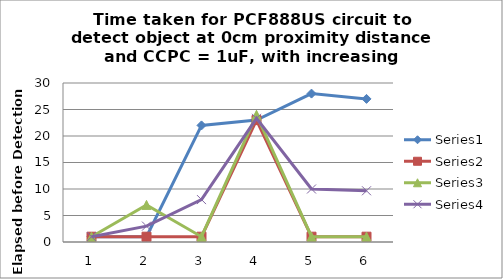
| Category | Series 0 | Series 1 | Series 2 | Series 3 |
|---|---|---|---|---|
| 0 | 1 | 1 | 1 | 1 |
| 1 | 1 | 1 | 7 | 3 |
| 2 | 22 | 1 | 1 | 8 |
| 3 | 23 | 23 | 24 | 23.333 |
| 4 | 28 | 1 | 1 | 10 |
| 5 | 27 | 1 | 1 | 9.667 |